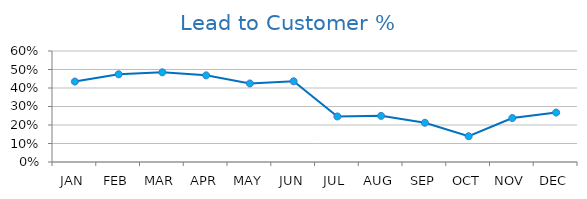
| Category | Lead to Customer % |
|---|---|
| JAN | 0.435 |
| FEB | 0.474 |
| MAR | 0.485 |
| APR | 0.468 |
| MAY | 0.424 |
| JUN | 0.436 |
| JUL | 0.246 |
| AUG | 0.249 |
| SEP | 0.212 |
| OCT | 0.139 |
| NOV | 0.238 |
| DEC | 0.267 |